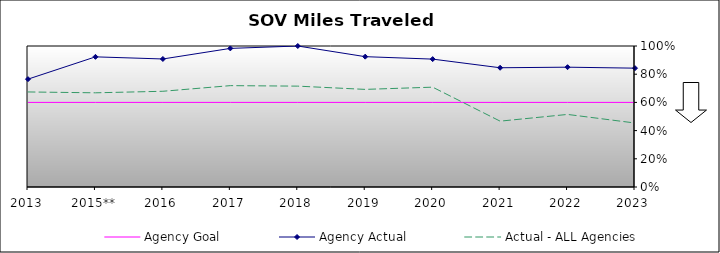
| Category | Agency Goal | Agency Actual | Actual - ALL Agencies |
|---|---|---|---|
| 2013 | 0.6 | 0.765 | 0.674 |
| 2015** | 0.6 | 0.923 | 0.668 |
| 2016 | 0.6 | 0.908 | 0.679 |
| 2017 | 0.6 | 0.983 | 0.719 |
| 2018 | 0.6 | 1 | 0.715 |
| 2019 | 0.6 | 0.924 | 0.692 |
| 2020 | 0.6 | 0.907 | 0.708 |
| 2021 | 0.6 | 0.846 | 0.467 |
| 2022 | 0.6 | 0.85 | 0.515 |
| 2023 | 0.6 | 0.843 | 0.454 |